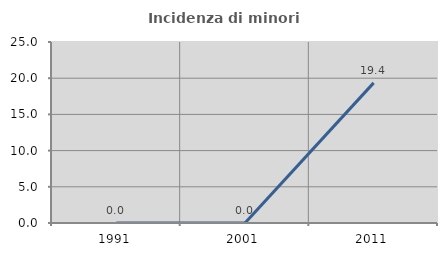
| Category | Incidenza di minori stranieri |
|---|---|
| 1991.0 | 0 |
| 2001.0 | 0 |
| 2011.0 | 19.355 |